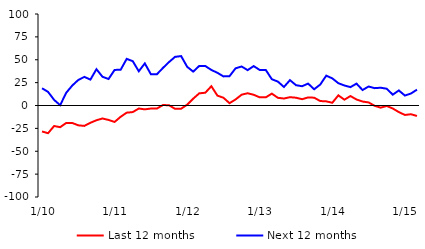
| Category | Last 12 months | Next 12 months |
|---|---|---|
|  1/10 | -28.38 | 18.87 |
|  2/10 | -30.28 | 14.86 |
|  3/10 | -22.41 | 6.12 |
|  4/10 | -23.71 | 0.35 |
|  5/10 | -19.08 | 13.92 |
|  6/10 | -19.11 | 21.81 |
|  7/10 | -21.66 | 27.94 |
|  8/10 | -22.29 | 31.28 |
|  9/10 | -18.88 | 28.29 |
|  10/10 | -16.12 | 39.67 |
|  11/10 | -14.18 | 31.39 |
|  12/10 | -15.78 | 28.96 |
|  1/11 | -17.96 | 38.89 |
|  2/11 | -12.33 | 39.05 |
|  3/11 | -7.84 | 50.96 |
|  4/11 | -7.2 | 48.47 |
|  5/11 | -3.3 | 37.42 |
|  6/11 | -4.21 | 45.99 |
|  7/11 | -3.33 | 34.17 |
|  8/11 | -3.33 | 34.17 |
|  9/11 | 0.51 | 41.09 |
|  10/11 | 0.28 | 47.47 |
|  11/11 | -3.65 | 53.17 |
|  12/11 | -3.52 | 53.99 |
|  1/12 | 0.85 | 42.3 |
|  2/12 | 7.49 | 37.02 |
|  3/12 | 13.29 | 43.26 |
|  4/12 | 13.96 | 43.14 |
|  5/12 | 21.08 | 38.87 |
|  6/12 | 10.81 | 35.74 |
|  7/12 | 8.46 | 31.81 |
|  8/12 | 2.55 | 32.03 |
|  9/12 | 6.58 | 40.6 |
|  10/12 | 11.79 | 42.65 |
|  11/12 | 13.41 | 38.66 |
|  12/12 | 11.71 | 43.07 |
|  1/13 | 8.92 | 38.82 |
|  2/13 | 8.92 | 38.82 |
|  3/13 | 12.98 | 28.75 |
|  4/13 | 8.4 | 26.12 |
|  5/13 | 7.64 | 20.26 |
|  6/13 | 9.1 | 27.71 |
|  7/13 | 8.51 | 22.2 |
|  8/13 | 6.89 | 21.06 |
|  9/13 | 8.81 | 23.95 |
|  10/13 | 8.54 | 17.76 |
|  11/13 | 4.88 | 22.87 |
|  12/13 | 4.53 | 32.62 |
|  1/14 | 2.99 | 29.64 |
|  2/14 | 11.1 | 24.37 |
|  3/14 | 6.35 | 21.86 |
|  4/14 | 10.34 | 20.09 |
|  5/14 | 6.57 | 23.91 |
|  6/14 | 4.33 | 16.91 |
|  7/14 | 3.35 | 20.75 |
|  8/14 | -0.33 | 18.95 |
|  9/14 | -2.37 | 19.44 |
|  10/14 | -0.5 | 18.32 |
|  11/14 | -3.3 | 11.85 |
|  12/14 | -7.21 | 16.46 |
|  1/15 | -10.32 | 10.88 |
|  2/15 | -9.55 | 13.1 |
|  3/15 | -11.45 | 17.32 |